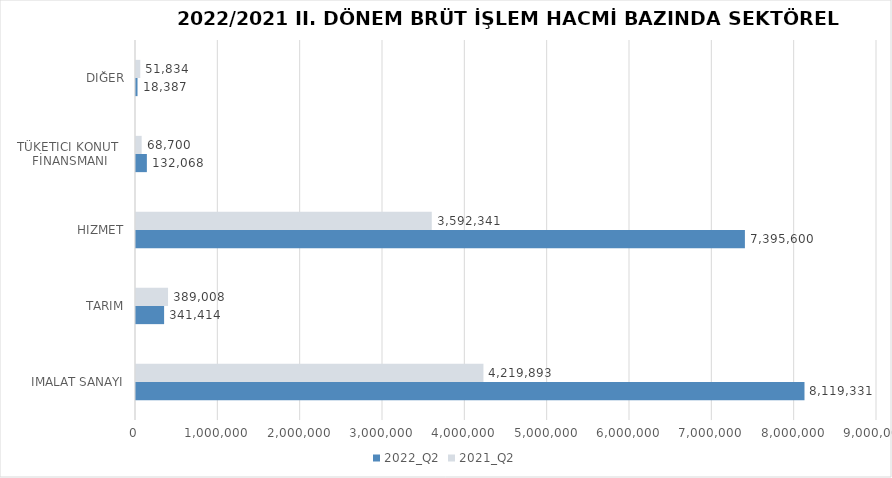
| Category | 2022_Q2 | 2021_Q2 |
|---|---|---|
| İMALAT SANAYİ | 8119330.631 | 4219892.617 |
| TARIM | 341413.852 | 389008.254 |
| HİZMET | 7395600.315 | 3592341.253 |
| TÜKETİCİ KONUT 
FİNANSMANI | 132068 | 68700 |
| DİĞER | 18387 | 51834 |